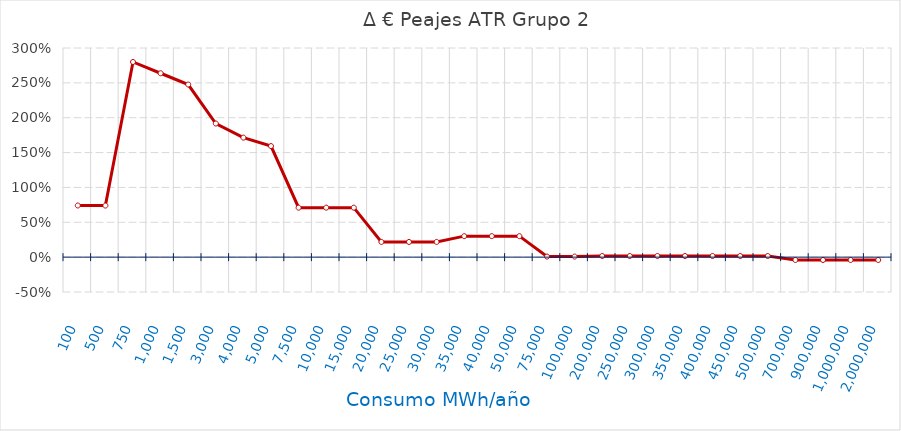
| Category | D €/año |
|---|---|
| 100.0 | 0.741 |
| 500.0 | 0.74 |
| 750.0 | 2.799 |
| 1000.0 | 2.638 |
| 1500.0 | 2.476 |
| 3000.0 | 1.917 |
| 4000.0 | 1.714 |
| 5000.0 | 1.593 |
| 7500.0 | 0.71 |
| 10000.0 | 0.71 |
| 15000.0 | 0.71 |
| 20000.0 | 0.218 |
| 25000.0 | 0.218 |
| 30000.0 | 0.218 |
| 35000.0 | 0.301 |
| 40000.0 | 0.301 |
| 50000.0 | 0.301 |
| 75000.0 | 0.008 |
| 100000.0 | 0.008 |
| 200000.0 | 0.016 |
| 250000.0 | 0.016 |
| 300000.0 | 0.016 |
| 350000.0 | 0.016 |
| 400000.0 | 0.016 |
| 450000.0 | 0.016 |
| 500000.0 | 0.016 |
| 700000.0 | -0.041 |
| 900000.0 | -0.041 |
| 1000000.0 | -0.041 |
| 2000000.0 | -0.041 |